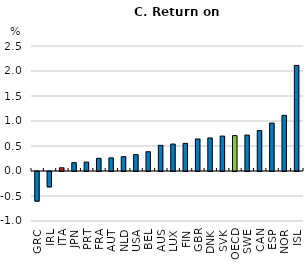
| Category | Return on Assets, Percent |
|---|---|
| GRC | -0.593 |
| IRL | -0.308 |
| ITA | 0.064 |
| JPN | 0.167 |
| PRT | 0.179 |
| FRA | 0.254 |
| AUT | 0.263 |
| NLD | 0.287 |
| USA | 0.328 |
| BEL | 0.385 |
| AUS | 0.513 |
| LUX | 0.539 |
| FIN | 0.552 |
| GBR | 0.641 |
| DNK | 0.661 |
| SVK | 0.698 |
| OECD | 0.708 |
| SWE | 0.718 |
| CAN | 0.809 |
| ESP | 0.959 |
| NOR | 1.114 |
| ISL | 2.111 |